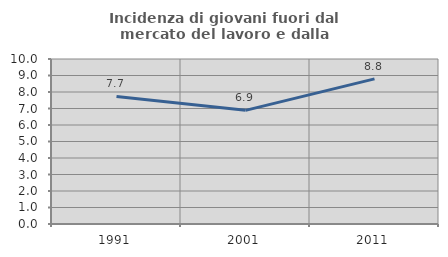
| Category | Incidenza di giovani fuori dal mercato del lavoro e dalla formazione  |
|---|---|
| 1991.0 | 7.728 |
| 2001.0 | 6.889 |
| 2011.0 | 8.795 |